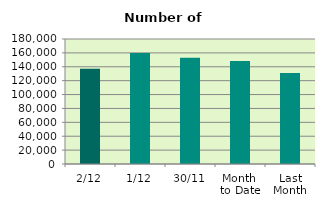
| Category | Series 0 |
|---|---|
| 2/12 | 137122 |
| 1/12 | 159682 |
| 30/11 | 153152 |
| Month 
to Date | 148402 |
| Last
Month | 131016.636 |